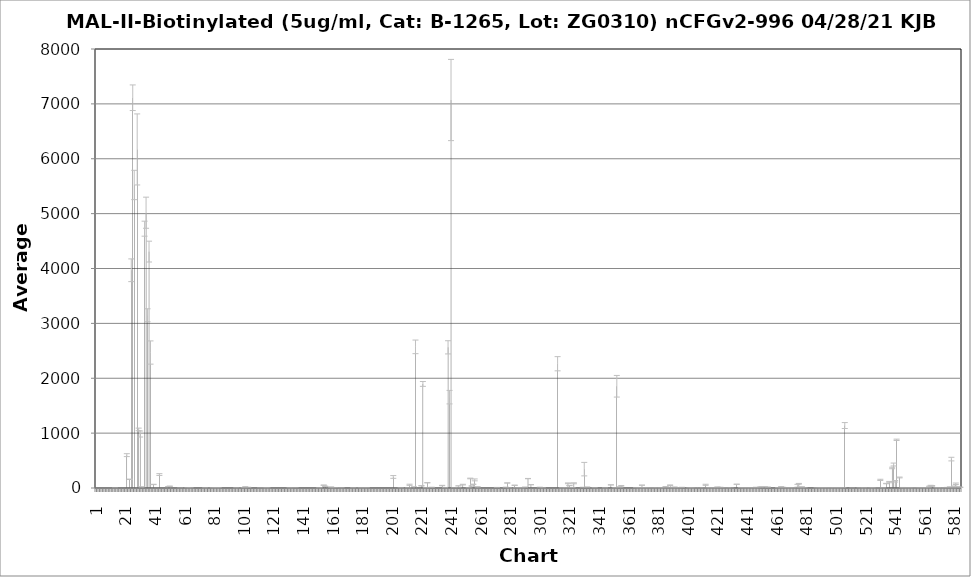
| Category | Average RFU |
|---|---|
| 1.0 | -3.5 |
| 2.0 | -7 |
| 3.0 | -2.5 |
| 4.0 | -6.5 |
| 5.0 | -2.75 |
| 6.0 | -6.5 |
| 7.0 | -4 |
| 8.0 | -3 |
| 9.0 | -5.5 |
| 10.0 | -4.5 |
| 11.0 | -2.75 |
| 12.0 | -1.25 |
| 13.0 | -2.25 |
| 14.0 | 0 |
| 15.0 | -5 |
| 16.0 | -3.75 |
| 17.0 | -4.25 |
| 18.0 | -2.25 |
| 19.0 | -2.75 |
| 20.0 | -2.25 |
| 21.0 | -6.25 |
| 22.0 | 599 |
| 23.0 | -4.5 |
| 24.0 | 158.5 |
| 25.0 | 3967.75 |
| 26.0 | 7112 |
| 27.0 | 5522 |
| 28.0 | -5.5 |
| 29.0 | 6169.75 |
| 30.0 | 1067.75 |
| 31.0 | 983.75 |
| 32.0 | 19 |
| 33.0 | -3.5 |
| 34.0 | 4725.75 |
| 35.0 | 5016.5 |
| 36.0 | 3147.75 |
| 37.0 | 4308 |
| 38.0 | 2468.75 |
| 39.0 | -6 |
| 40.0 | 64.75 |
| 41.0 | -1.5 |
| 42.0 | -1.75 |
| 43.0 | -3.25 |
| 44.0 | 245.5 |
| 45.0 | -3.75 |
| 46.0 | -3 |
| 47.0 | -5.5 |
| 48.0 | -8.5 |
| 49.0 | -5.5 |
| 50.0 | 25 |
| 51.0 | 31.75 |
| 52.0 | -2.5 |
| 53.0 | -3 |
| 54.0 | -5.25 |
| 55.0 | -5.5 |
| 56.0 | -3.25 |
| 57.0 | -7 |
| 58.0 | 0.5 |
| 59.0 | -2.75 |
| 60.0 | -5 |
| 61.0 | -4.25 |
| 62.0 | -3.5 |
| 63.0 | -0.25 |
| 64.0 | -4.25 |
| 65.0 | -0.25 |
| 66.0 | -2.5 |
| 67.0 | -6.75 |
| 68.0 | -3 |
| 69.0 | -4 |
| 70.0 | -3 |
| 71.0 | -4.25 |
| 72.0 | -6 |
| 73.0 | -7.5 |
| 74.0 | -3.75 |
| 75.0 | -2.25 |
| 76.0 | -4.5 |
| 77.0 | -6.25 |
| 78.0 | -7.25 |
| 79.0 | -5.25 |
| 80.0 | -9.75 |
| 81.0 | -1.75 |
| 82.0 | 1.5 |
| 83.0 | 4 |
| 84.0 | -6.25 |
| 85.0 | -6.25 |
| 86.0 | -4 |
| 87.0 | -3.75 |
| 88.0 | -9.5 |
| 89.0 | -2.5 |
| 90.0 | -3 |
| 91.0 | -7.75 |
| 92.0 | -4.5 |
| 93.0 | -6.75 |
| 94.0 | -6 |
| 95.0 | -7.5 |
| 96.0 | -1.25 |
| 97.0 | -1 |
| 98.0 | -2.5 |
| 99.0 | -4.25 |
| 100.0 | -4.5 |
| 101.0 | 7.25 |
| 102.0 | 13.75 |
| 103.0 | -2.5 |
| 104.0 | 11 |
| 105.0 | -6.5 |
| 106.0 | -2.5 |
| 107.0 | -8.5 |
| 108.0 | -2.75 |
| 109.0 | -4.5 |
| 110.0 | -3 |
| 111.0 | -22.25 |
| 112.0 | 0.5 |
| 113.0 | -5.75 |
| 114.0 | -2 |
| 115.0 | -15 |
| 116.0 | -0.5 |
| 117.0 | -1.25 |
| 118.0 | -3.75 |
| 119.0 | -7 |
| 120.0 | -1.5 |
| 121.0 | -2.75 |
| 122.0 | -1 |
| 123.0 | -5 |
| 124.0 | -2 |
| 125.0 | -4.25 |
| 126.0 | -2.75 |
| 127.0 | -3.25 |
| 128.0 | -3.5 |
| 129.0 | -3.5 |
| 130.0 | -5.5 |
| 131.0 | -3.5 |
| 132.0 | 0.75 |
| 133.0 | -4.5 |
| 134.0 | -53.75 |
| 135.0 | -5.5 |
| 136.0 | 1.5 |
| 137.0 | -4.25 |
| 138.0 | -27 |
| 139.0 | -2.5 |
| 140.0 | -1.5 |
| 141.0 | -1 |
| 142.0 | -45.25 |
| 143.0 | -4.5 |
| 144.0 | -2.75 |
| 145.0 | -3 |
| 146.0 | -5 |
| 147.0 | -11.75 |
| 148.0 | -4.75 |
| 149.0 | -5 |
| 150.0 | -2.5 |
| 151.0 | -2 |
| 152.0 | -0.5 |
| 153.0 | -3.5 |
| 154.0 | -4.5 |
| 155.0 | 51.5 |
| 156.0 | 30.75 |
| 157.0 | -2.5 |
| 158.0 | -4.75 |
| 159.0 | -6.25 |
| 160.0 | 16.5 |
| 161.0 | -0.5 |
| 162.0 | -7.5 |
| 163.0 | 3.75 |
| 164.0 | -2.75 |
| 165.0 | -23 |
| 166.0 | -5.25 |
| 167.0 | -0.25 |
| 168.0 | -2 |
| 169.0 | -5.25 |
| 170.0 | -13.75 |
| 171.0 | -3.75 |
| 172.0 | -2.5 |
| 173.0 | -4.25 |
| 174.0 | -2.5 |
| 175.0 | -1.5 |
| 176.0 | -5.25 |
| 177.0 | -3.25 |
| 178.0 | -8.75 |
| 179.0 | -4.75 |
| 180.0 | -1.25 |
| 181.0 | -5 |
| 182.0 | -5 |
| 183.0 | -3.25 |
| 184.0 | -0.75 |
| 185.0 | -7.25 |
| 186.0 | -7 |
| 187.0 | -6.5 |
| 188.0 | -82 |
| 189.0 | -4.75 |
| 190.0 | -2.75 |
| 191.0 | -3.25 |
| 192.0 | -5.25 |
| 193.0 | -3.75 |
| 194.0 | -10 |
| 195.0 | -7.5 |
| 196.0 | -6.75 |
| 197.0 | -3.5 |
| 198.0 | -3.5 |
| 199.0 | -3 |
| 200.0 | -5.25 |
| 201.0 | -28.5 |
| 202.0 | 201.25 |
| 203.0 | -1.5 |
| 204.0 | -2 |
| 205.0 | -5.75 |
| 206.0 | -1.25 |
| 207.0 | -2.5 |
| 208.0 | -5 |
| 209.0 | -8.5 |
| 210.0 | -4.5 |
| 211.0 | -1 |
| 212.0 | -0.5 |
| 213.0 | 58.5 |
| 214.0 | -1.75 |
| 215.0 | -16.5 |
| 216.0 | 8.5 |
| 217.0 | 2572 |
| 218.0 | -7.5 |
| 219.0 | -4 |
| 220.0 | -3.5 |
| 221.0 | 40.5 |
| 222.0 | 1896.25 |
| 223.0 | -3 |
| 224.0 | 3.25 |
| 225.0 | 95.75 |
| 226.0 | -5.5 |
| 227.0 | -5.25 |
| 228.0 | 11.25 |
| 229.0 | -8.75 |
| 230.0 | -5.25 |
| 231.0 | -3 |
| 232.0 | -5.75 |
| 233.0 | -5.25 |
| 234.0 | -2.5 |
| 235.0 | 45 |
| 236.0 | -2 |
| 237.0 | 4.5 |
| 238.0 | -4.25 |
| 239.0 | 2563.5 |
| 240.0 | 1655.5 |
| 241.0 | 7070.25 |
| 242.0 | -4 |
| 243.0 | 0.5 |
| 244.0 | -5 |
| 245.0 | -3.5 |
| 246.0 | 29 |
| 247.0 | -2.25 |
| 248.0 | -3.5 |
| 249.0 | 61.5 |
| 250.0 | -8 |
| 251.0 | -7.25 |
| 252.0 | -9 |
| 253.0 | -4 |
| 254.0 | 173.75 |
| 255.0 | 35.75 |
| 256.0 | 67.25 |
| 257.0 | 147.75 |
| 258.0 | -0.75 |
| 259.0 | 13.75 |
| 260.0 | -4.25 |
| 261.0 | -8.25 |
| 262.0 | -7.25 |
| 263.0 | -8.75 |
| 264.0 | -3 |
| 265.0 | -4 |
| 266.0 | -3.5 |
| 267.0 | -5.75 |
| 268.0 | -7.25 |
| 269.0 | -1.25 |
| 270.0 | -5.5 |
| 271.0 | -3.25 |
| 272.0 | -21.25 |
| 273.0 | -7.25 |
| 274.0 | -7.5 |
| 275.0 | -8.5 |
| 276.0 | -3.5 |
| 277.0 | -7.5 |
| 278.0 | -1.5 |
| 279.0 | 91.5 |
| 280.0 | -3.25 |
| 281.0 | -6 |
| 282.0 | -2.75 |
| 283.0 | -3.5 |
| 284.0 | 49.5 |
| 285.0 | -2.25 |
| 286.0 | -7.25 |
| 287.0 | -3.5 |
| 288.0 | 2.25 |
| 289.0 | 2.5 |
| 290.0 | -5 |
| 291.0 | 14.25 |
| 292.0 | -2 |
| 293.0 | 171.5 |
| 294.0 | -1.25 |
| 295.0 | 60.5 |
| 296.0 | -1.75 |
| 297.0 | -8 |
| 298.0 | -5.5 |
| 299.0 | -3.25 |
| 300.0 | -7.75 |
| 301.0 | 4.25 |
| 302.0 | -5 |
| 303.0 | -11.25 |
| 304.0 | -7.25 |
| 305.0 | -1.5 |
| 306.0 | -4.5 |
| 307.0 | -33.25 |
| 308.0 | -3 |
| 309.0 | -4 |
| 310.0 | -3.25 |
| 311.0 | -2.5 |
| 312.0 | -2.25 |
| 313.0 | 2264.5 |
| 314.0 | -6.25 |
| 315.0 | -4 |
| 316.0 | 1 |
| 317.0 | -5.75 |
| 318.0 | -2.5 |
| 319.0 | -0.5 |
| 320.0 | 85.25 |
| 321.0 | 43.75 |
| 322.0 | -2.75 |
| 323.0 | -1.75 |
| 324.0 | 86 |
| 325.0 | -16.25 |
| 326.0 | -8.75 |
| 327.0 | -3.25 |
| 328.0 | -6.25 |
| 329.0 | -2.5 |
| 330.0 | 2.75 |
| 331.0 | 343.75 |
| 332.0 | -11.25 |
| 333.0 | 15.5 |
| 334.0 | -5.5 |
| 335.0 | -6.25 |
| 336.0 | -7.75 |
| 337.0 | -21.75 |
| 338.0 | 3 |
| 339.0 | -6.5 |
| 340.0 | -3 |
| 341.0 | -7.75 |
| 342.0 | -9.25 |
| 343.0 | -6 |
| 344.0 | -4.75 |
| 345.0 | -1.75 |
| 346.0 | -3.25 |
| 347.0 | -60.75 |
| 348.0 | -13 |
| 349.0 | 57 |
| 350.0 | -0.75 |
| 351.0 | -7.25 |
| 352.0 | 1.75 |
| 353.0 | 1854 |
| 354.0 | -22 |
| 355.0 | 17 |
| 356.0 | 33 |
| 357.0 | -10.5 |
| 358.0 | -3.25 |
| 359.0 | -13.75 |
| 360.0 | -47.75 |
| 361.0 | -5.25 |
| 362.0 | -9.5 |
| 363.0 | -4 |
| 364.0 | -4.75 |
| 365.0 | -2.5 |
| 366.0 | -6.75 |
| 367.0 | -3.75 |
| 368.0 | -0.75 |
| 369.0 | 2.75 |
| 370.0 | 51.5 |
| 371.0 | -1 |
| 372.0 | -1.25 |
| 373.0 | 1.5 |
| 374.0 | 0.5 |
| 375.0 | -1 |
| 376.0 | -2.25 |
| 377.0 | 0 |
| 378.0 | 0 |
| 379.0 | -1.25 |
| 380.0 | -2 |
| 381.0 | -3.75 |
| 382.0 | -0.75 |
| 383.0 | 1.25 |
| 384.0 | -0.25 |
| 385.0 | -2 |
| 386.0 | 22.75 |
| 387.0 | -1 |
| 388.0 | -0.25 |
| 389.0 | 50.25 |
| 390.0 | -5.5 |
| 391.0 | -1 |
| 392.0 | 15.25 |
| 393.0 | 5 |
| 394.0 | -1.5 |
| 395.0 | 0.5 |
| 396.0 | 2.25 |
| 397.0 | 10.25 |
| 398.0 | -1 |
| 399.0 | -1 |
| 400.0 | -1.25 |
| 401.0 | -1 |
| 402.0 | -0.25 |
| 403.0 | 0.5 |
| 404.0 | 0 |
| 405.0 | -1.25 |
| 406.0 | 0.25 |
| 407.0 | -1.25 |
| 408.0 | -3.25 |
| 409.0 | 0.25 |
| 410.0 | -1.75 |
| 411.0 | 0.5 |
| 412.0 | -22.5 |
| 413.0 | 58.25 |
| 414.0 | -12 |
| 415.0 | -0.5 |
| 416.0 | -0.75 |
| 417.0 | -0.25 |
| 418.0 | -1 |
| 419.0 | 3 |
| 420.0 | 0.75 |
| 421.0 | 16 |
| 422.0 | -2 |
| 423.0 | 11.25 |
| 424.0 | -0.25 |
| 425.0 | -2 |
| 426.0 | -4 |
| 427.0 | -6.5 |
| 428.0 | 0 |
| 429.0 | -0.75 |
| 430.0 | 0.75 |
| 431.0 | -1.75 |
| 432.0 | -1.5 |
| 433.0 | -0.75 |
| 434.0 | 68.25 |
| 435.0 | -2 |
| 436.0 | -6.75 |
| 437.0 | -10 |
| 438.0 | -49.25 |
| 439.0 | 2.25 |
| 440.0 | 1.25 |
| 441.0 | -0.5 |
| 442.0 | -0.25 |
| 443.0 | 0 |
| 444.0 | 0 |
| 445.0 | 3 |
| 446.0 | 0.75 |
| 447.0 | 9 |
| 448.0 | 2.75 |
| 449.0 | -3 |
| 450.0 | 17 |
| 451.0 | 24 |
| 452.0 | -5.5 |
| 453.0 | 22.5 |
| 454.0 | -3 |
| 455.0 | 15 |
| 456.0 | -6.5 |
| 457.0 | -4 |
| 458.0 | -4 |
| 459.0 | -3.25 |
| 460.0 | -3.5 |
| 461.0 | -3 |
| 462.0 | 4 |
| 463.0 | 1.25 |
| 464.0 | 18.5 |
| 465.0 | 11.5 |
| 466.0 | 7.25 |
| 467.0 | 1 |
| 468.0 | 4 |
| 469.0 | -0.25 |
| 470.0 | 2 |
| 471.0 | 0.5 |
| 472.0 | 1.25 |
| 473.0 | -2.75 |
| 474.0 | -1.5 |
| 475.0 | 40.75 |
| 476.0 | 77.25 |
| 477.0 | -2 |
| 478.0 | 19.25 |
| 479.0 | -1.5 |
| 480.0 | 0.25 |
| 481.0 | -2.25 |
| 482.0 | -3.25 |
| 483.0 | -8 |
| 484.0 | -0.75 |
| 485.0 | -4.25 |
| 486.0 | -14.25 |
| 487.0 | -2 |
| 488.0 | 0 |
| 489.0 | -1.25 |
| 490.0 | 1 |
| 491.0 | 1 |
| 492.0 | -0.25 |
| 493.0 | 5.75 |
| 494.0 | 1.25 |
| 495.0 | -1.5 |
| 496.0 | -2.5 |
| 497.0 | -0.75 |
| 498.0 | -3.75 |
| 499.0 | -4.75 |
| 500.0 | -1.75 |
| 501.0 | -2.5 |
| 502.0 | -5 |
| 503.0 | -0.5 |
| 504.0 | -3.5 |
| 505.0 | -4 |
| 506.0 | -0.75 |
| 507.0 | 1138.25 |
| 508.0 | -3.5 |
| 509.0 | -1.75 |
| 510.0 | -12.75 |
| 511.0 | -5 |
| 512.0 | 0 |
| 513.0 | -6.5 |
| 514.0 | -1.75 |
| 515.0 | -2.5 |
| 516.0 | -1.25 |
| 517.0 | -0.25 |
| 518.0 | -2.5 |
| 519.0 | -2.25 |
| 520.0 | -1 |
| 521.0 | 0.5 |
| 522.0 | -5.75 |
| 523.0 | -4.75 |
| 524.0 | -5 |
| 525.0 | 1.25 |
| 526.0 | -1.5 |
| 527.0 | -4.5 |
| 528.0 | -2 |
| 529.0 | -0.75 |
| 530.0 | 0 |
| 531.0 | 148.25 |
| 532.0 | -4.75 |
| 533.0 | -1.5 |
| 534.0 | -4.25 |
| 535.0 | 80.75 |
| 536.0 | -5.25 |
| 537.0 | 107.75 |
| 538.0 | -1.25 |
| 539.0 | 365 |
| 540.0 | 428 |
| 541.0 | 122.25 |
| 542.0 | 878.25 |
| 543.0 | -2 |
| 544.0 | 191.5 |
| 545.0 | -3.75 |
| 546.0 | 5 |
| 547.0 | 0.25 |
| 548.0 | -0.75 |
| 549.0 | 0.75 |
| 550.0 | -0.75 |
| 551.0 | 0.5 |
| 552.0 | -3.75 |
| 553.0 | -0.5 |
| 554.0 | -3 |
| 555.0 | -1.75 |
| 556.0 | -3.25 |
| 557.0 | 3 |
| 558.0 | 0.75 |
| 559.0 | 0.75 |
| 560.0 | -0.25 |
| 561.0 | 1.25 |
| 562.0 | -4.25 |
| 563.0 | -0.5 |
| 564.0 | 24.5 |
| 565.0 | 42 |
| 566.0 | 38.5 |
| 567.0 | -0.75 |
| 568.0 | -7.5 |
| 569.0 | -0.25 |
| 570.0 | 2 |
| 571.0 | -12.25 |
| 572.0 | -0.25 |
| 573.0 | -3 |
| 574.0 | -3.75 |
| 575.0 | 0.5 |
| 576.0 | 6.25 |
| 577.0 | -1.25 |
| 578.0 | 9.75 |
| 579.0 | 526.75 |
| 580.0 | 2 |
| 581.0 | 30.75 |
| 582.0 | 77 |
| 583.0 | 21.25 |
| 584.0 | -0.75 |
| 585.0 | 13 |